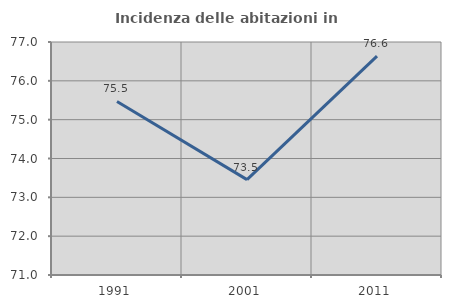
| Category | Incidenza delle abitazioni in proprietà  |
|---|---|
| 1991.0 | 75.469 |
| 2001.0 | 73.456 |
| 2011.0 | 76.635 |